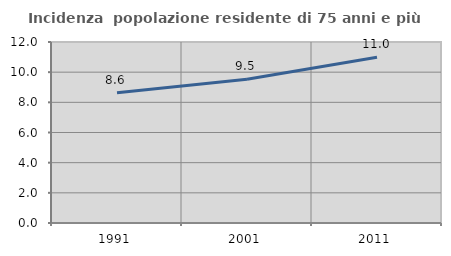
| Category | Incidenza  popolazione residente di 75 anni e più |
|---|---|
| 1991.0 | 8.638 |
| 2001.0 | 9.526 |
| 2011.0 | 10.988 |